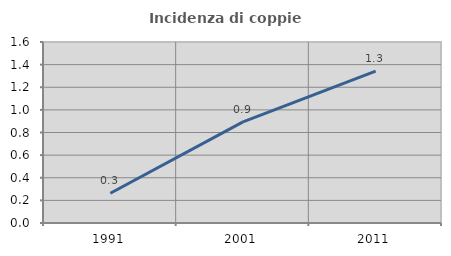
| Category | Incidenza di coppie miste |
|---|---|
| 1991.0 | 0.263 |
| 2001.0 | 0.894 |
| 2011.0 | 1.343 |